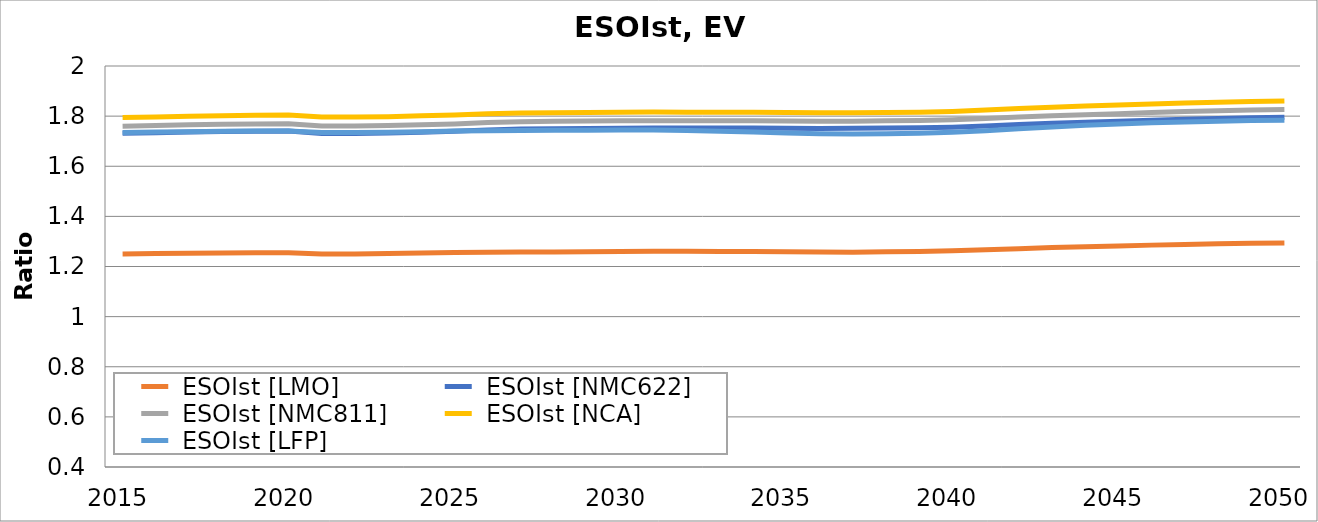
| Category |  ESOIst [LMO] |  ESOIst [NMC622] |  ESOIst [NMC811] |  ESOIst [NCA] |  ESOIst [LFP] |
|---|---|---|---|---|---|
| 2015.0 | 1.25 | 1.731 | 1.76 | 1.794 | 1.734 |
| 2016.0 | 1.252 | 1.734 | 1.763 | 1.797 | 1.736 |
| 2017.0 | 1.253 | 1.736 | 1.765 | 1.8 | 1.738 |
| 2018.0 | 1.254 | 1.738 | 1.767 | 1.802 | 1.74 |
| 2019.0 | 1.255 | 1.74 | 1.769 | 1.803 | 1.74 |
| 2020.0 | 1.255 | 1.741 | 1.77 | 1.804 | 1.741 |
| 2021.0 | 1.25 | 1.731 | 1.76 | 1.796 | 1.735 |
| 2022.0 | 1.25 | 1.731 | 1.76 | 1.796 | 1.735 |
| 2023.0 | 1.252 | 1.733 | 1.763 | 1.798 | 1.736 |
| 2024.0 | 1.254 | 1.736 | 1.766 | 1.801 | 1.738 |
| 2025.0 | 1.256 | 1.739 | 1.769 | 1.804 | 1.74 |
| 2026.0 | 1.257 | 1.745 | 1.775 | 1.81 | 1.742 |
| 2027.0 | 1.258 | 1.748 | 1.778 | 1.813 | 1.743 |
| 2028.0 | 1.258 | 1.75 | 1.779 | 1.814 | 1.743 |
| 2029.0 | 1.259 | 1.751 | 1.78 | 1.815 | 1.744 |
| 2030.0 | 1.26 | 1.752 | 1.781 | 1.816 | 1.745 |
| 2031.0 | 1.261 | 1.752 | 1.782 | 1.816 | 1.745 |
| 2032.0 | 1.261 | 1.752 | 1.782 | 1.816 | 1.742 |
| 2033.0 | 1.26 | 1.752 | 1.782 | 1.816 | 1.739 |
| 2034.0 | 1.26 | 1.752 | 1.781 | 1.815 | 1.736 |
| 2035.0 | 1.259 | 1.752 | 1.781 | 1.814 | 1.733 |
| 2036.0 | 1.257 | 1.751 | 1.78 | 1.813 | 1.73 |
| 2037.0 | 1.257 | 1.751 | 1.78 | 1.813 | 1.728 |
| 2038.0 | 1.258 | 1.752 | 1.781 | 1.815 | 1.729 |
| 2039.0 | 1.26 | 1.753 | 1.782 | 1.816 | 1.731 |
| 2040.0 | 1.262 | 1.756 | 1.785 | 1.819 | 1.735 |
| 2041.0 | 1.267 | 1.761 | 1.79 | 1.824 | 1.742 |
| 2042.0 | 1.271 | 1.766 | 1.796 | 1.83 | 1.749 |
| 2043.0 | 1.276 | 1.771 | 1.801 | 1.835 | 1.757 |
| 2044.0 | 1.279 | 1.776 | 1.806 | 1.84 | 1.763 |
| 2045.0 | 1.282 | 1.78 | 1.81 | 1.844 | 1.769 |
| 2046.0 | 1.285 | 1.784 | 1.814 | 1.848 | 1.774 |
| 2047.0 | 1.288 | 1.788 | 1.818 | 1.852 | 1.777 |
| 2048.0 | 1.29 | 1.791 | 1.821 | 1.856 | 1.78 |
| 2049.0 | 1.292 | 1.794 | 1.824 | 1.858 | 1.782 |
| 2050.0 | 1.294 | 1.796 | 1.826 | 1.86 | 1.784 |